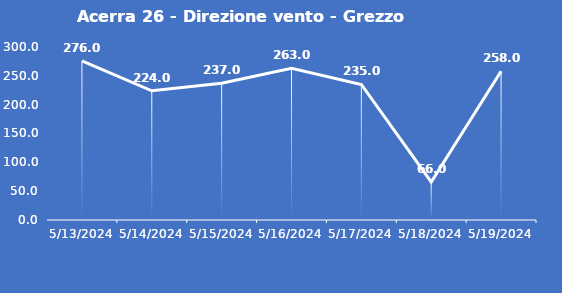
| Category | Acerra 26 - Direzione vento - Grezzo (°N) |
|---|---|
| 5/13/24 | 276 |
| 5/14/24 | 224 |
| 5/15/24 | 237 |
| 5/16/24 | 263 |
| 5/17/24 | 235 |
| 5/18/24 | 66 |
| 5/19/24 | 258 |